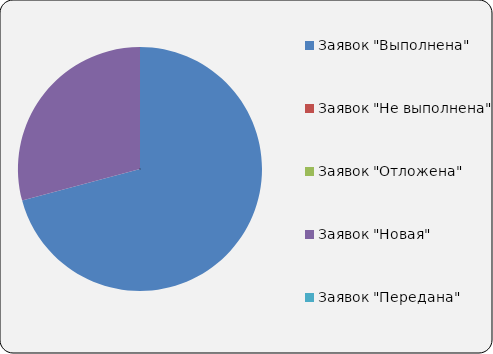
| Category | Series 0 |
|---|---|
| Заявок "Выполнена" | 17 |
| Заявок "Не выполнена" | 0 |
| Заявок "Отложена" | 0 |
| Заявок "Новая" | 7 |
| Заявок "Передана" | 0 |